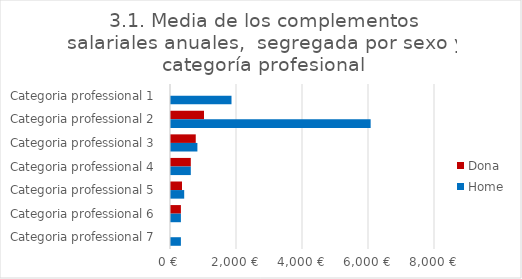
| Category | Dona | Home |
|---|---|---|
| Categoria professional 1 | 0 | 1833.333 |
| Categoria professional 2 | 1000 | 6050 |
| Categoria professional 3 | 750 | 800 |
| Categoria professional 4 | 600 | 600 |
| Categoria professional 5 | 333.333 | 400 |
| Categoria professional 6 | 300 | 300 |
| Categoria professional 7 | 0 | 300 |